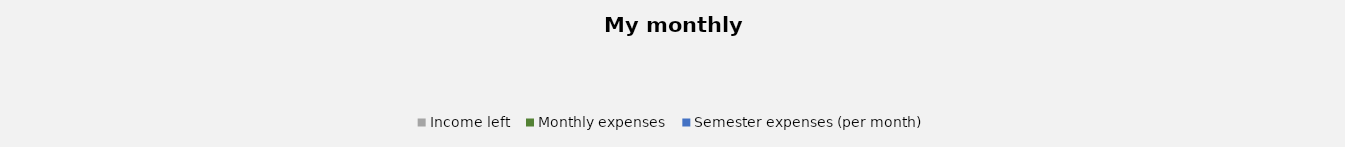
| Category | Income left | Monthly expenses | Semester expenses (per month) |
|---|---|---|---|
| 0 | 0 | 0 | 0 |